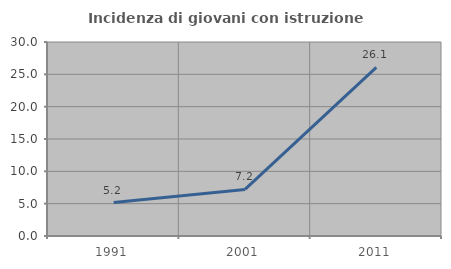
| Category | Incidenza di giovani con istruzione universitaria |
|---|---|
| 1991.0 | 5.166 |
| 2001.0 | 7.2 |
| 2011.0 | 26.087 |